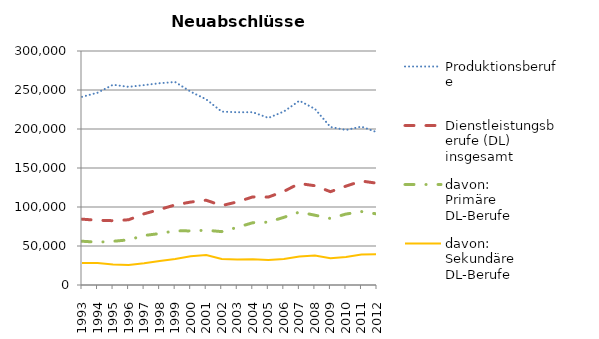
| Category | Produktionsberufe | Dienstleistungsberufe (DL) insgesamt | davon:
Primäre  DL-Berufe | davon: 
Sekundäre DL-Berufe |
|---|---|---|---|---|
| 1993.0 | 241230 | 84402 | 56109 | 28293 |
| 1994.0 | 246528 | 82977 | 54885 | 28092 |
| 1995.0 | 256734 | 82458 | 56022 | 26439 |
| 1996.0 | 254049 | 83631 | 57891 | 25740 |
| 1997.0 | 256287 | 91281 | 63417 | 27864 |
| 1998.0 | 258708 | 96831 | 65958 | 30873 |
| 1999.0 | 260253 | 102693 | 69438 | 33255 |
| 2000.0 | 247800 | 106338 | 69372 | 36966 |
| 2001.0 | 238008 | 108663 | 70221 | 38442 |
| 2002.0 | 222300 | 101796 | 68433 | 33366 |
| 2003.0 | 221457 | 106521 | 73866 | 32655 |
| 2004.0 | 221541 | 112968 | 79860 | 33105 |
| 2005.0 | 214209 | 112719 | 80583 | 32136 |
| 2006.0 | 222372 | 120039 | 86742 | 33297 |
| 2007.0 | 236220 | 130122 | 93486 | 36633 |
| 2008.0 | 225834 | 127269 | 89478 | 37791 |
| 2009.0 | 202584 | 119652 | 85230 | 34419 |
| 2010.0 | 198726 | 126756 | 90966 | 35787 |
| 2011.0 | 203061 | 133272 | 94134 | 39138 |
| 2012.0 | 195777 | 130473 | 91101 | 39372 |